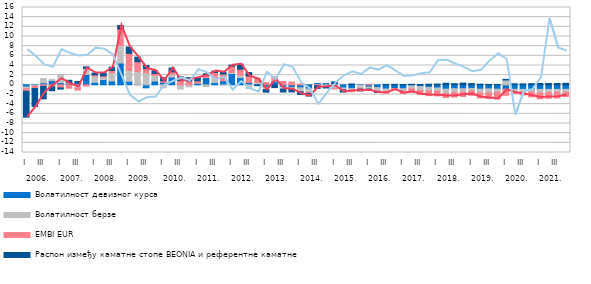
| Category | Волатилност девизног курса | Волатилност берзе | EMBI EUR | Распон између каматне стопе BEONIA и референтне каматне стопе |
|---|---|---|---|---|
| 0 | -0.452 | -0.353 | -0.525 | -5.353 |
| 1 | -0.11 | -0.152 | -0.494 | -3.707 |
| 2 | 0.42 | 0.877 | -0.318 | -2.581 |
| 3 | 0.879 | 0.241 | -0.424 | -0.789 |
| 4 | 0.449 | 1.698 | -0.651 | -0.227 |
| 5 | 0.297 | 0.191 | -0.71 | 0.451 |
| 6 | 0.385 | -0.625 | -0.472 | 0.322 |
| 7 | 2.14 | 1.27 | -0.271 | 0.307 |
| 8 | 0.511 | 1.318 | 0.225 | 0.377 |
| 9 | 1.082 | 0.571 | 0.208 | 0.619 |
| 10 | 0.8 | 1.734 | 0.426 | 0.681 |
| 11 | 4.509 | 3.622 | 3.407 | 0.73 |
| 12 | 0.735 | 2.233 | 3.539 | 1.303 |
| 13 | 0.005 | 2.738 | 2.042 | 0.947 |
| 14 | -0.614 | 2.494 | 0.878 | 0.62 |
| 15 | 0.798 | 1.133 | 0.419 | 0.578 |
| 16 | 0.513 | -0.631 | 0.313 | 0.649 |
| 17 | 1.607 | 0.595 | 0.479 | 0.791 |
| 18 | -0.088 | -0.787 | 0.892 | 0.762 |
| 19 | -0.072 | -0.322 | 0.816 | 0.677 |
| 20 | 0.334 | 0.072 | 0.428 | 0.652 |
| 21 | 1.489 | -0.346 | 0.48 | 0.318 |
| 22 | 0.461 | 1.099 | 0.993 | 0.283 |
| 23 | 0.831 | -0.002 | 1.42 | 0.341 |
| 24 | 2.334 | 0.231 | 1.275 | 0.233 |
| 25 | 1.493 | 0.536 | 1.211 | 1.027 |
| 26 | 0.491 | -0.773 | 1.342 | 0.703 |
| 27 | 0.139 | 0.373 | 0.828 | -0.16 |
| 28 | -0.531 | -0.457 | 0.464 | -0.527 |
| 29 | 0.732 | 0.529 | 0.44 | -0.571 |
| 30 | -0.486 | -0.387 | 0.704 | -0.61 |
| 31 | -0.539 | -0.455 | 0.574 | -0.472 |
| 32 | -0.616 | -0.821 | 0.162 | -0.549 |
| 33 | -0.823 | -0.795 | -0.147 | -0.558 |
| 34 | 0.266 | -0.058 | -0.141 | -0.53 |
| 35 | 0.249 | -0.51 | -0.018 | -0.124 |
| 36 | 0.284 | -0.811 | -0.045 | 0.326 |
| 37 | -0.641 | -0.319 | -0.119 | -0.409 |
| 38 | -0.774 | -0.591 | -0.046 | 0.171 |
| 39 | -0.09 | -0.622 | -0.194 | -0.34 |
| 40 | -0.449 | -0.441 | 0.02 | -0.271 |
| 41 | -0.572 | -0.757 | -0.077 | -0.185 |
| 42 | -0.851 | -0.589 | -0.286 | 0.08 |
| 43 | -0.766 | -0.04 | -0.258 | 0.093 |
| 44 | -0.802 | -0.492 | -0.484 | 0.06 |
| 45 | -0.118 | -0.72 | -0.72 | 0.102 |
| 46 | -0.343 | -0.808 | -0.86 | 0.078 |
| 47 | -0.523 | -0.741 | -0.97 | 0.127 |
| 48 | -0.644 | -0.653 | -0.993 | 0.159 |
| 49 | -0.895 | -0.863 | -0.884 | 0.328 |
| 50 | -0.796 | -0.81 | -0.921 | 0.247 |
| 51 | -0.806 | -0.729 | -0.871 | 0.356 |
| 52 | -0.745 | -0.509 | -0.91 | 0.26 |
| 53 | -0.897 | -0.791 | -1.009 | 0.134 |
| 54 | -0.831 | -0.811 | -1.168 | 0.069 |
| 55 | -0.9 | -0.616 | -1.435 | 0.073 |
| 56 | -0.907 | 1.006 | -1.267 | 0.12 |
| 57 | -0.923 | -0.665 | -0.226 | 0.219 |
| 58 | -0.938 | -0.523 | -0.63 | 0.2 |
| 59 | -0.938 | -0.571 | -0.982 | 0.239 |
| 60 | -0.94 | -0.738 | -1.224 | 0.276 |
| 61 | -0.939 | -0.657 | -1.176 | 0.275 |
| 62 | -0.94 | -0.604 | -1.188 | 0.282 |
| 63 | -0.935 | -0.616 | -0.873 | 0.32 |